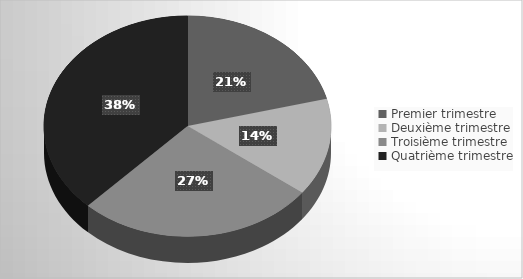
| Category | Candidats |
|---|---|
| Premier trimestre | 25 |
| Deuxième trimestre | 17 |
| Troisième trimestre | 32 |
| Quatrième trimestre | 45 |